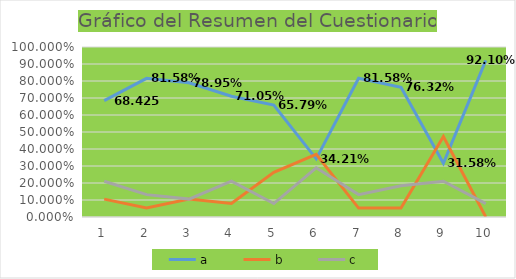
| Category | a | b | c |
|---|---|---|---|
| 0 | 0.684 | 0.105 | 0.21 |
| 1 | 0.816 | 0.053 | 0.132 |
| 2 | 0.79 | 0.105 | 0.105 |
| 3 | 0.71 | 0.079 | 0.21 |
| 4 | 0.658 | 0.263 | 0.079 |
| 5 | 0.342 | 0.368 | 0.29 |
| 6 | 0.816 | 0.053 | 0.132 |
| 7 | 0.763 | 0.053 | 0.184 |
| 8 | 0.316 | 0.474 | 0.21 |
| 9 | 0.921 | 0 | 0.079 |